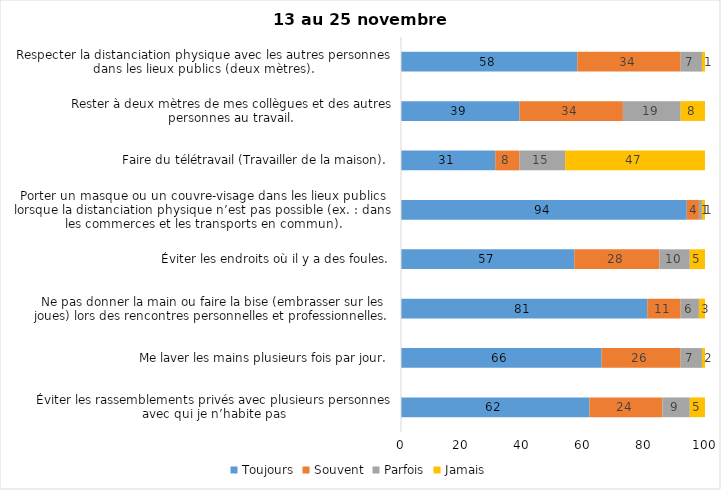
| Category | Toujours | Souvent | Parfois | Jamais |
|---|---|---|---|---|
| Éviter les rassemblements privés avec plusieurs personnes avec qui je n’habite pas | 62 | 24 | 9 | 5 |
| Me laver les mains plusieurs fois par jour. | 66 | 26 | 7 | 2 |
| Ne pas donner la main ou faire la bise (embrasser sur les joues) lors des rencontres personnelles et professionnelles. | 81 | 11 | 6 | 3 |
| Éviter les endroits où il y a des foules. | 57 | 28 | 10 | 5 |
| Porter un masque ou un couvre-visage dans les lieux publics lorsque la distanciation physique n’est pas possible (ex. : dans les commerces et les transports en commun). | 94 | 4 | 1 | 1 |
| Faire du télétravail (Travailler de la maison). | 31 | 8 | 15 | 47 |
| Rester à deux mètres de mes collègues et des autres personnes au travail. | 39 | 34 | 19 | 8 |
| Respecter la distanciation physique avec les autres personnes dans les lieux publics (deux mètres). | 58 | 34 | 7 | 1 |